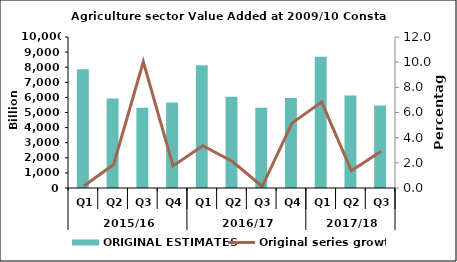
| Category | ORIGINAL ESTIMATES |
|---|---|
| 0 | 7870.584 |
| 1 | 5925.739 |
| 2 | 5307.794 |
| 3 | 5665.043 |
| 4 | 8135.034 |
| 5 | 6050.461 |
| 6 | 5314.454 |
| 7 | 5957.119 |
| 8 | 8690.215 |
| 9 | 6132.866 |
| 10 | 5469.205 |